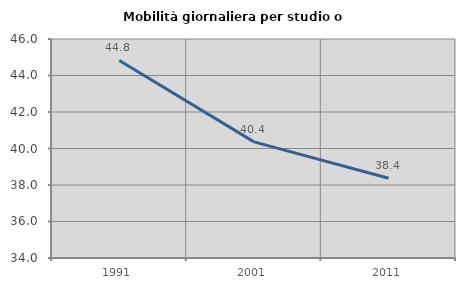
| Category | Mobilità giornaliera per studio o lavoro |
|---|---|
| 1991.0 | 44.825 |
| 2001.0 | 40.362 |
| 2011.0 | 38.37 |